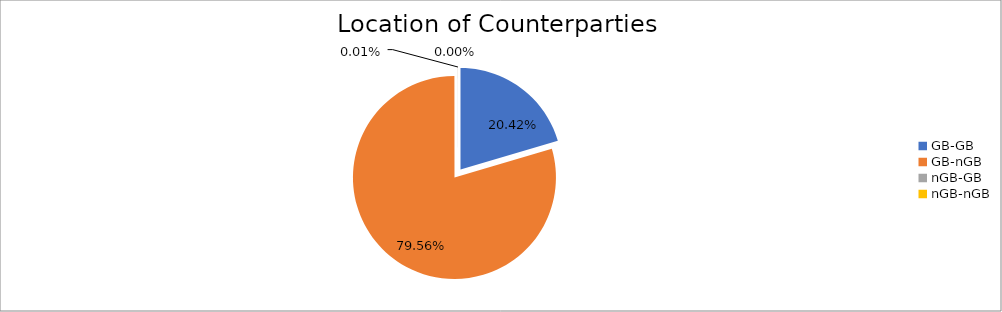
| Category | Series 0 |
|---|---|
| GB-GB | 1863370.081 |
| GB-nGB | 7259261.501 |
| nGB-GB | 1075.78 |
| nGB-nGB | 400.345 |